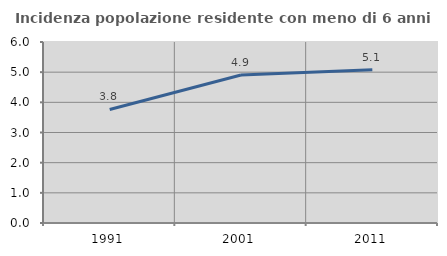
| Category | Incidenza popolazione residente con meno di 6 anni |
|---|---|
| 1991.0 | 3.764 |
| 2001.0 | 4.907 |
| 2011.0 | 5.08 |